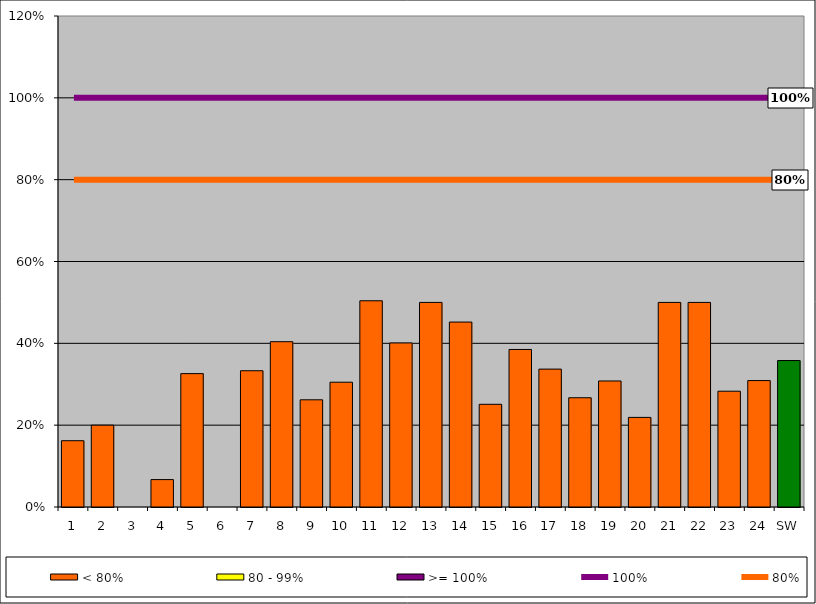
| Category | < 80% | 80 - 99% | >= 100% |
|---|---|---|---|
| 1 | 0.162 | 0 | 0 |
| 2 | 0.2 | 0 | 0 |
| 3 | 0 | 0 | 0 |
| 4 | 0.067 | 0 | 0 |
| 5 | 0.326 | 0 | 0 |
| 6 | 0 | 0 | 0 |
| 7 | 0.333 | 0 | 0 |
| 8 | 0.404 | 0 | 0 |
| 9 | 0.262 | 0 | 0 |
| 10 | 0.305 | 0 | 0 |
| 11 | 0.504 | 0 | 0 |
| 12 | 0.401 | 0 | 0 |
| 13 | 0.5 | 0 | 0 |
| 14 | 0.452 | 0 | 0 |
| 15 | 0.251 | 0 | 0 |
| 16 | 0.385 | 0 | 0 |
| 17 | 0.337 | 0 | 0 |
| 18 | 0.267 | 0 | 0 |
| 19 | 0.308 | 0 | 0 |
| 20 | 0.219 | 0 | 0 |
| 21 | 0.5 | 0 | 0 |
| 22 | 0.5 | 0 | 0 |
| 23 | 0.283 | 0 | 0 |
| 24 | 0.309 | 0 | 0 |
| SW | 0.358 | 0 | 0 |